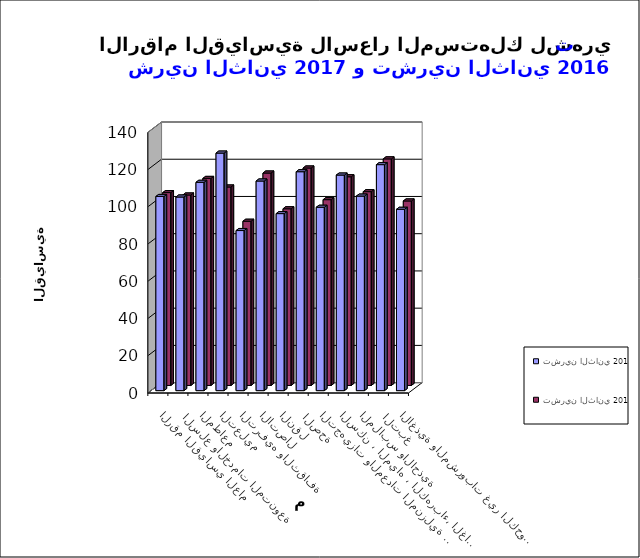
| Category | تشرين الثاني 2017      | تشرين الثاني 2016 |
|---|---|---|
| الاغذية والمشروبات غير الكحولية | 97.4 | 99.1 |
|  التبغ | 121.4 | 121.7 |
| الملابس والاحذية | 104.5 | 104.1 |
| السكن ، المياه ، الكهرباء، الغاز  | 115.8 | 112.1 |
| التجهيزات والمعدات المنزلية والصيانة | 98.5 | 99.8 |
|  الصحة | 117.6 | 116.8 |
| النقل | 95.1 | 94.9 |
| الاتصال | 112.6 | 114.1 |
| الترفيه والثقافة | 86 | 88.2 |
| التعليم | 127.6 | 106.6 |
| المطاعم  | 111.9 | 111.2 |
|  السلع والخدمات المتنوعة | 104 | 102.3 |
| الرقم القياسي العام | 104.3 | 103.6 |